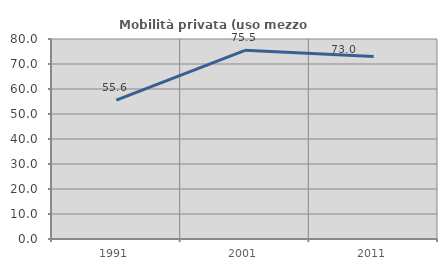
| Category | Mobilità privata (uso mezzo privato) |
|---|---|
| 1991.0 | 55.556 |
| 2001.0 | 75.472 |
| 2011.0 | 73.009 |